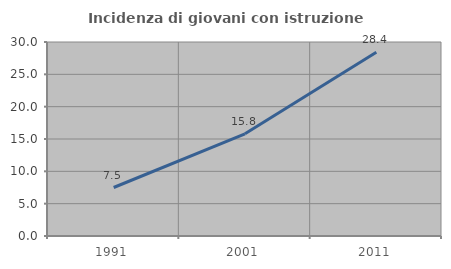
| Category | Incidenza di giovani con istruzione universitaria |
|---|---|
| 1991.0 | 7.5 |
| 2001.0 | 15.797 |
| 2011.0 | 28.423 |